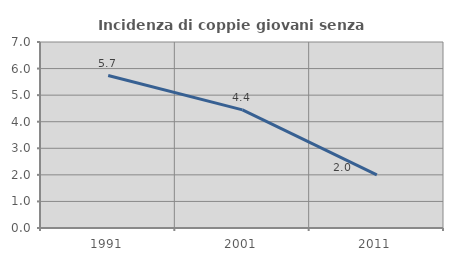
| Category | Incidenza di coppie giovani senza figli |
|---|---|
| 1991.0 | 5.738 |
| 2001.0 | 4.444 |
| 2011.0 | 2 |